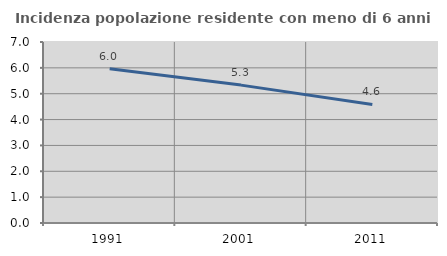
| Category | Incidenza popolazione residente con meno di 6 anni |
|---|---|
| 1991.0 | 5.967 |
| 2001.0 | 5.333 |
| 2011.0 | 4.585 |